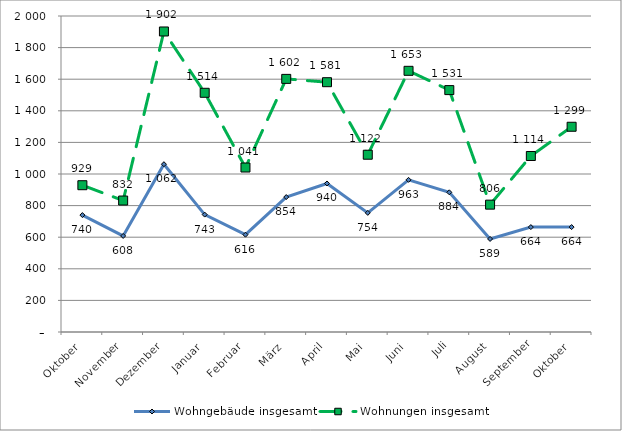
| Category | Wohngebäude insgesamt | Wohnungen insgesamt |
|---|---|---|
| Oktober | 740 | 929 |
| November | 608 | 832 |
| Dezember | 1062 | 1902 |
| Januar | 743 | 1514 |
| Februar | 616 | 1041 |
| März | 854 | 1602 |
| April | 940 | 1581 |
| Mai | 754 | 1122 |
| Juni | 963 | 1653 |
| Juli | 884 | 1531 |
| August | 589 | 806 |
| September | 664 | 1114 |
| Oktober | 664 | 1299 |